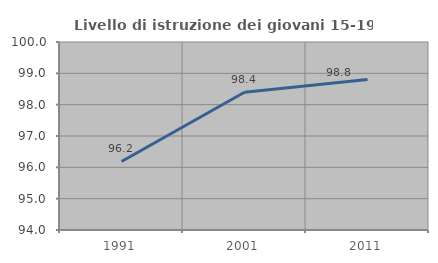
| Category | Livello di istruzione dei giovani 15-19 anni |
|---|---|
| 1991.0 | 96.186 |
| 2001.0 | 98.396 |
| 2011.0 | 98.805 |